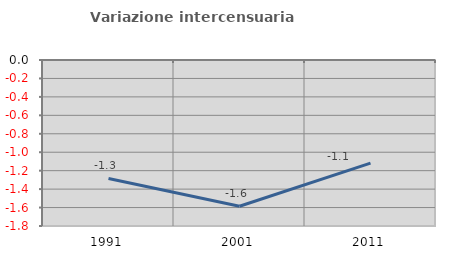
| Category | Variazione intercensuaria annua |
|---|---|
| 1991.0 | -1.284 |
| 2001.0 | -1.586 |
| 2011.0 | -1.118 |